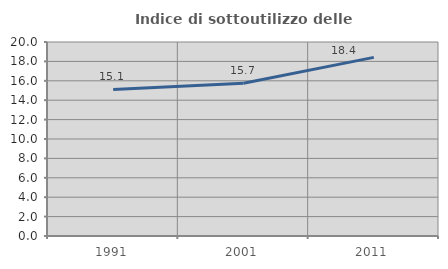
| Category | Indice di sottoutilizzo delle abitazioni  |
|---|---|
| 1991.0 | 15.107 |
| 2001.0 | 15.741 |
| 2011.0 | 18.417 |